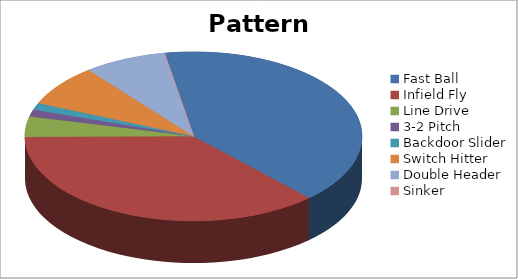
| Category | Pattern Distribution |
|---|---|
| Fast Ball | 31 |
| Infield Fly | 28 |
| Line Drive | 3 |
| 3-2 Pitch | 1 |
| Backdoor Slider | 1 |
| Switch Hitter | 6 |
| Double Header | 6 |
| Sinker | 0 |